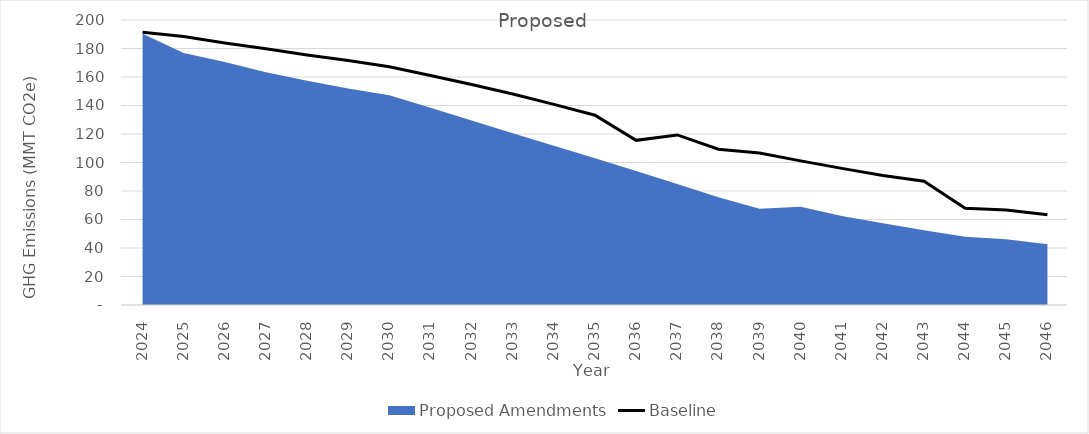
| Category | Baseline  |
|---|---|
| 2024.0 | 191.357 |
| 2025.0 | 188.439 |
| 2026.0 | 183.798 |
| 2027.0 | 179.753 |
| 2028.0 | 175.419 |
| 2029.0 | 171.532 |
| 2030.0 | 167.16 |
| 2031.0 | 161.031 |
| 2032.0 | 154.691 |
| 2033.0 | 148.038 |
| 2034.0 | 140.791 |
| 2035.0 | 133.188 |
| 2036.0 | 115.548 |
| 2037.0 | 119.355 |
| 2038.0 | 109.345 |
| 2039.0 | 106.623 |
| 2040.0 | 101.123 |
| 2041.0 | 95.876 |
| 2042.0 | 90.88 |
| 2043.0 | 86.822 |
| 2044.0 | 67.842 |
| 2045.0 | 66.703 |
| 2046.0 | 63.352 |